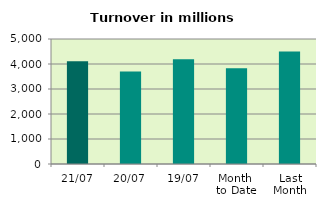
| Category | Series 0 |
|---|---|
| 21/07 | 4105.898 |
| 20/07 | 3703.036 |
| 19/07 | 4188.197 |
| Month 
to Date | 3833.854 |
| Last
Month | 4502.251 |